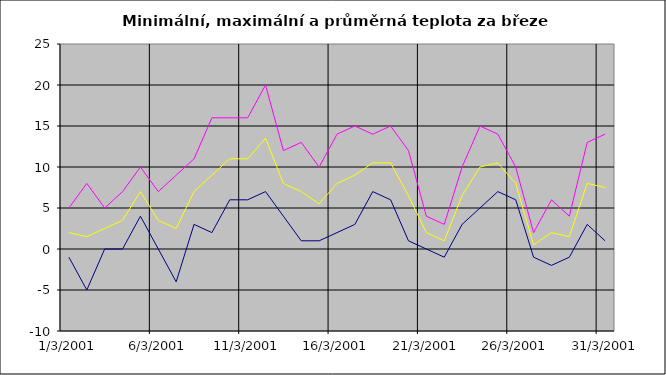
| Category | Series 0 | Series 1 | Series 2 |
|---|---|---|---|
| 2001-03-01 | -1 | 5 | 2 |
| 2001-03-02 | -5 | 8 | 1.5 |
| 2001-03-03 | 0 | 5 | 2.5 |
| 2001-03-04 | 0 | 7 | 3.5 |
| 2001-03-05 | 4 | 10 | 7 |
| 2001-03-06 | 0 | 7 | 3.5 |
| 2001-03-07 | -4 | 9 | 2.5 |
| 2001-03-08 | 3 | 11 | 7 |
| 2001-03-09 | 2 | 16 | 9 |
| 2001-03-10 | 6 | 16 | 11 |
| 2001-03-11 | 6 | 16 | 11 |
| 2001-03-12 | 7 | 20 | 13.5 |
| 2001-03-13 | 4 | 12 | 8 |
| 2001-03-14 | 1 | 13 | 7 |
| 2001-03-15 | 1 | 10 | 5.5 |
| 2001-03-16 | 2 | 14 | 8 |
| 2001-03-17 | 3 | 15 | 9 |
| 2001-03-18 | 7 | 14 | 10.5 |
| 2001-03-19 | 6 | 15 | 10.5 |
| 2001-03-20 | 1 | 12 | 6.5 |
| 2001-03-21 | 0 | 4 | 2 |
| 2001-03-22 | -1 | 3 | 1 |
| 2001-03-23 | 3 | 10 | 6.5 |
| 2001-03-24 | 5 | 15 | 10 |
| 2001-03-25 | 7 | 14 | 10.5 |
| 2001-03-26 | 6 | 10 | 8 |
| 2001-03-27 | -1 | 2 | 0.5 |
| 2001-03-28 | -2 | 6 | 2 |
| 2001-03-29 | -1 | 4 | 1.5 |
| 2001-03-30 | 3 | 13 | 8 |
| 2001-03-31 | 1 | 14 | 7.5 |